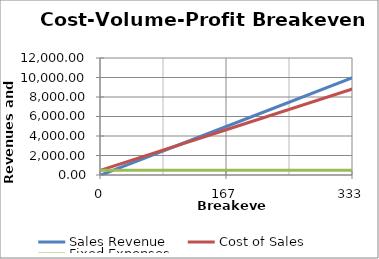
| Category | Sales Revenue | Cost of Sales | Fixed Expenses |
|---|---|---|---|
| 0.0 | 0 | 500 | 500 |
| 166.66666666666666 | 5000 | 4666.667 | 500 |
| 333.3333333333333 | 10000 | 8833.333 | 500 |